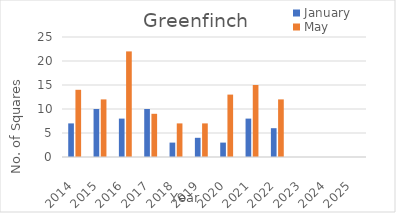
| Category | January | May |
|---|---|---|
| 2014.0 | 7 | 14 |
| 2015.0 | 10 | 12 |
| 2016.0 | 8 | 22 |
| 2017.0 | 10 | 9 |
| 2018.0 | 3 | 7 |
| 2019.0 | 4 | 7 |
| 2020.0 | 3 | 13 |
| 2021.0 | 8 | 15 |
| 2022.0 | 6 | 12 |
| 2023.0 | 0 | 0 |
| 2024.0 | 0 | 0 |
| 2025.0 | 0 | 0 |